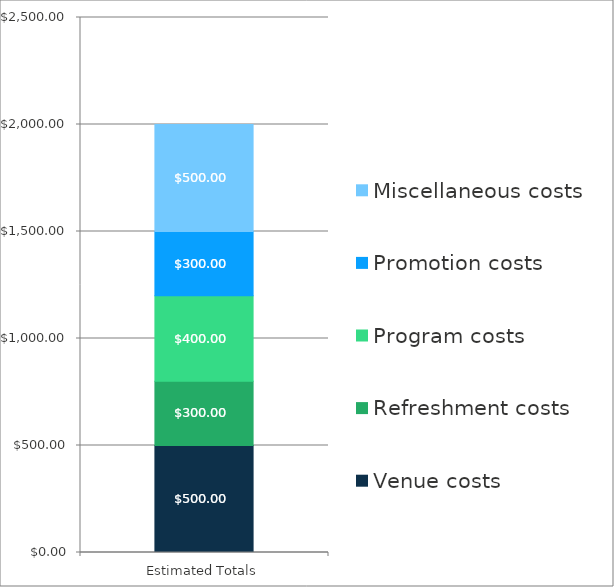
| Category | Venue costs | Refreshment costs | Program costs | Promotion costs | Miscellaneous costs |
|---|---|---|---|---|---|
| Estimated Totals | 500 | 300 | 400 | 300 | 500 |